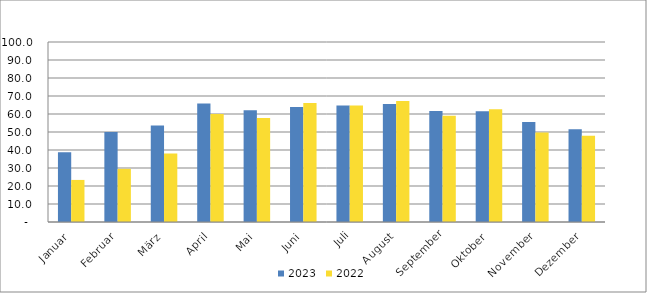
| Category | 2023 | 2022 |
|---|---|---|
| Januar | 38.728 | 23.372 |
| Februar | 50.041 | 29.529 |
| März | 53.676 | 38.087 |
| April | 65.827 | 60.041 |
| Mai | 62.148 | 57.822 |
| Juni | 63.957 | 66.128 |
| Juli | 64.739 | 64.724 |
| August | 65.608 | 67.281 |
| September | 61.609 | 59.058 |
| Oktober | 61.596 | 62.605 |
| November | 55.582 | 49.696 |
| Dezember | 51.548 | 47.949 |